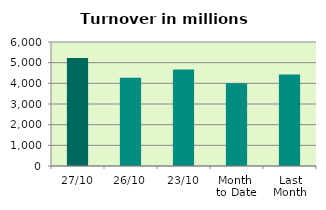
| Category | Series 0 |
|---|---|
| 27/10 | 5222.286 |
| 26/10 | 4272.887 |
| 23/10 | 4665.985 |
| Month 
to Date | 4002.582 |
| Last
Month | 4425.778 |